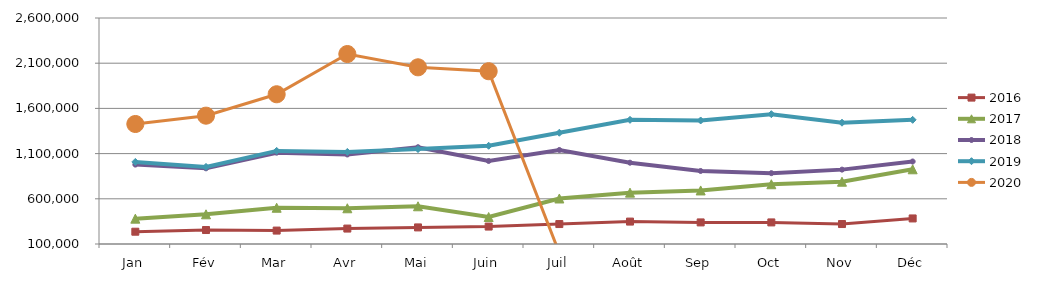
| Category | 2015 | 2016 | 2017 | 2018 | 2019 | 2020 |
|---|---|---|---|---|---|---|
| Jan |  | 235903.093 | 380222.25 | 978468.279 | 1007982.373 | 1427566.131 |
| Fév |  | 254650.591 | 428502.997 | 937137.209 | 952616.766 | 1519499.131 |
| Mar |  | 248425.98 | 500955.694 | 1110199.711 | 1129815.679 | 1756286.369 |
| Avr |  | 270687.752 | 495255.535 | 1090229.308 | 1118398.221 | 2201408.333 |
| Mai |  | 283507.34 | 517298.538 | 1170512.154 | 1150217.455 | 2054563.553 |
| Juin |  | 292820.053 | 398427.247 | 1018295.812 | 1186623.687 | 2011198.676 |
| Juil |  | 320615.91 | 603419.402 | 1140133.118 | 1330812.699 | 0 |
| Août |  | 348014.816 | 667973.667 | 999343.146 | 1473280.035 | 0 |
| Sep |  | 338807.949 | 692403.495 | 907808.882 | 1466448.158 | 0 |
| Oct |  | 338820.212 | 760969.174 | 883825.979 | 1536100.268 | 0 |
| Nov |  | 320858.147 | 789037.665 | 922678.039 | 1441770.199 | 0 |
| Déc |  | 382727.181 | 926372.399 | 1012620.724 | 1473565.92 | 0 |